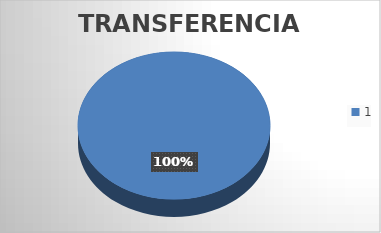
| Category | Transferencias: |
|---|---|
| 0 | 7 |